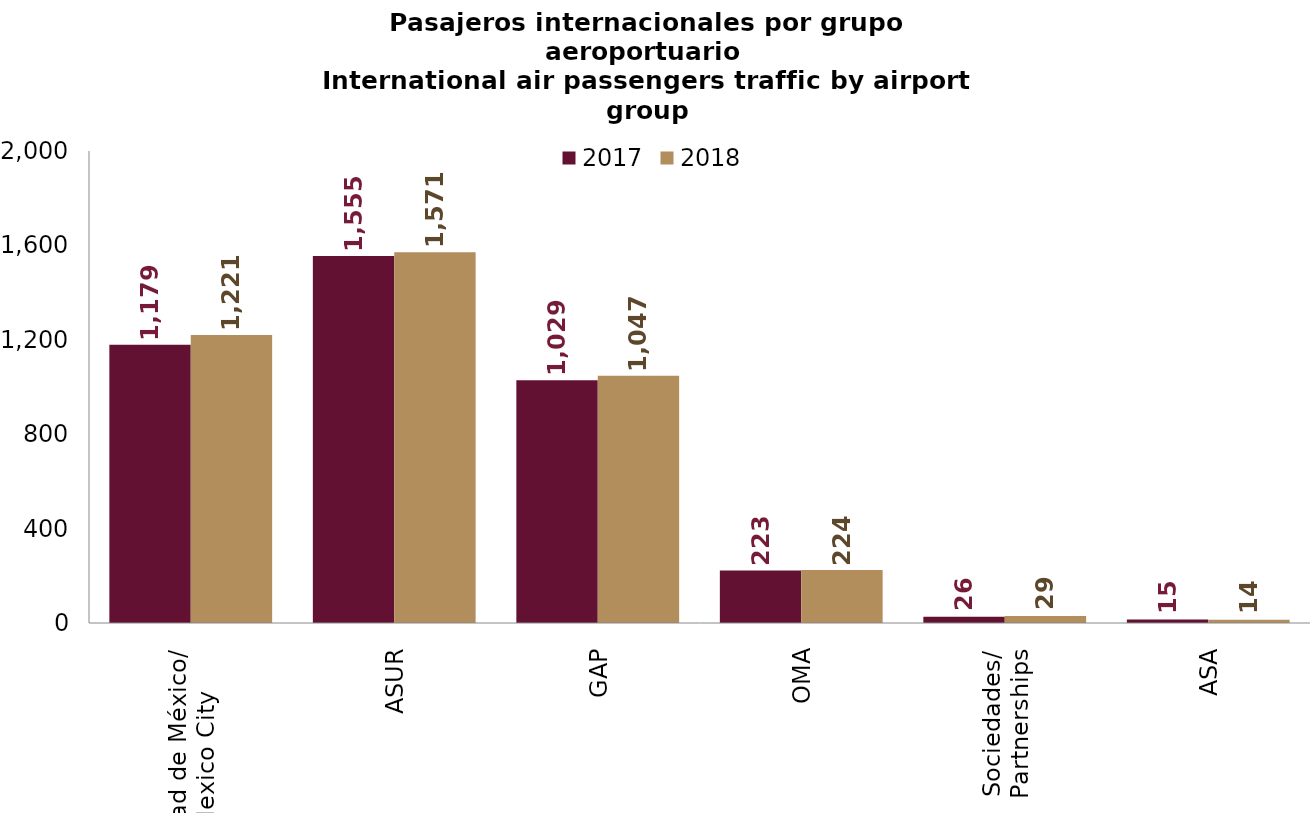
| Category | 2017 | 2018 |
|---|---|---|
| Ciudad de México/
Mexico City | 1178.773 | 1220.756 |
| ASUR | 1554.696 | 1570.956 |
| GAP | 1028.57 | 1047.264 |
| OMA | 222.626 | 224.302 |
| Sociedades/
Partnerships | 26.133 | 29.438 |
| ASA | 14.802 | 13.506 |